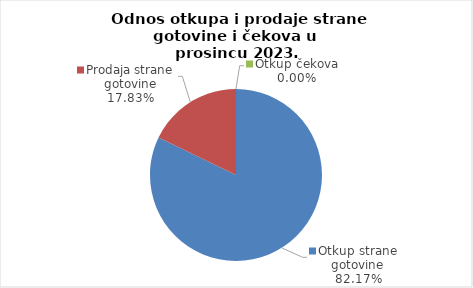
| Category | Series 0 |
|---|---|
| Otkup strane gotovine | 82.166 |
| Prodaja strane gotovine | 17.834 |
| Otkup čekova | 0 |